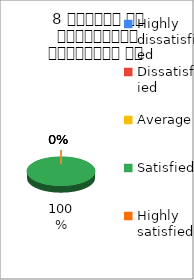
| Category | 8 शिक्षक का सम्प्रेषण सुस्पष्ठ है  |
|---|---|
| Highly dissatisfied | 0 |
| Dissatisfied | 0 |
| Average | 0 |
| Satisfied | 2 |
| Highly satisfied | 0 |